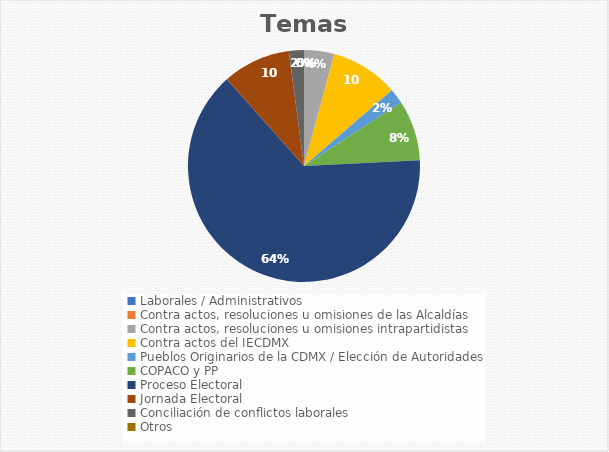
| Category | Temas |
|---|---|
| Laborales / Administrativos | 0 |
| Contra actos, resoluciones u omisiones de las Alcaldías | 0 |
| Contra actos, resoluciones u omisiones intrapartidistas | 4 |
| Contra actos del IECDMX | 9 |
| Pueblos Originarios de la CDMX / Elección de Autoridades | 2 |
| COPACO y PP | 8 |
| Proceso Electoral | 61 |
| Jornada Electoral | 9 |
| Conciliación de conflictos laborales | 2 |
| Otros | 0 |